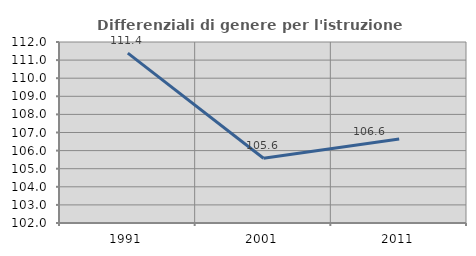
| Category | Differenziali di genere per l'istruzione superiore |
|---|---|
| 1991.0 | 111.385 |
| 2001.0 | 105.575 |
| 2011.0 | 106.642 |